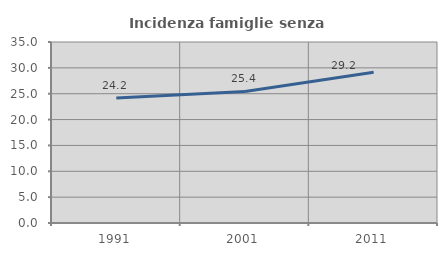
| Category | Incidenza famiglie senza nuclei |
|---|---|
| 1991.0 | 24.188 |
| 2001.0 | 25.436 |
| 2011.0 | 29.156 |